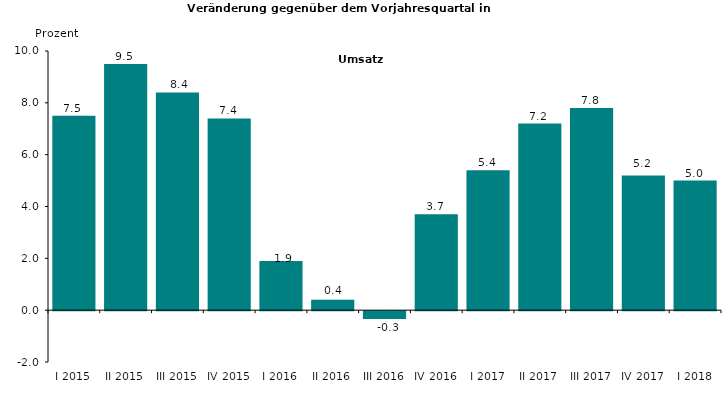
| Category | Series 0 |
|---|---|
| I 2015 | 7.5 |
| II 2015 | 9.5 |
| III 2015 | 8.4 |
| IV 2015 | 7.4 |
| I 2016 | 1.9 |
| II 2016 | 0.4 |
| III 2016 | -0.3 |
| IV 2016 | 3.7 |
| I 2017 | 5.4 |
| II 2017 | 7.2 |
| III 2017 | 7.8 |
| IV 2017 | 5.2 |
| I 2018 | 5 |